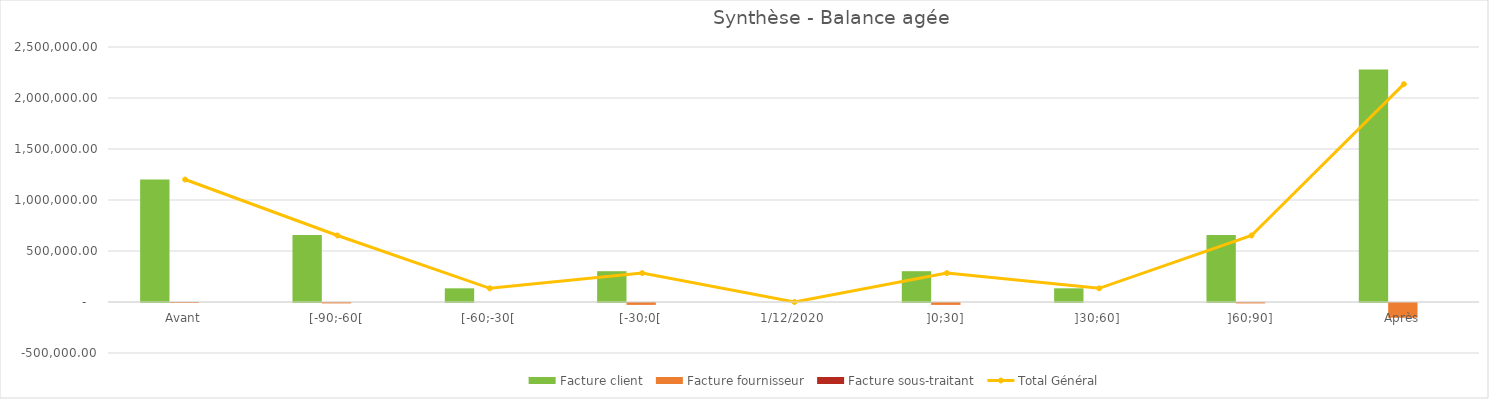
| Category | Facture client | Facture fournisseur | Facture sous-traitant |
|---|---|---|---|
| Avant | 1200848.06 | -103.25 | 0 |
| [-90;-60[ | 656242.12 | -4001.45 | 0 |
| [-60;-30[ | 134071.14 | 0 | 0 |
| [-30;0[ | 301961.74 | -18562.84 | 0 |
| 12/01/2020 | 0 | 0 | 0 |
| ]0;30] | 301961.74 | -18562.84 | 0 |
| ]30;60] | 134071.14 | 0 | 0 |
| ]60;90] | 656242.12 | -4001.45 | 0 |
| Après | 2280264.74 | -144670.5 | 0 |